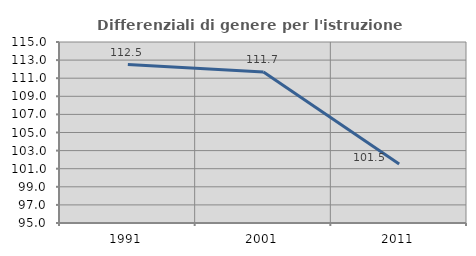
| Category | Differenziali di genere per l'istruzione superiore |
|---|---|
| 1991.0 | 112.511 |
| 2001.0 | 111.677 |
| 2011.0 | 101.513 |